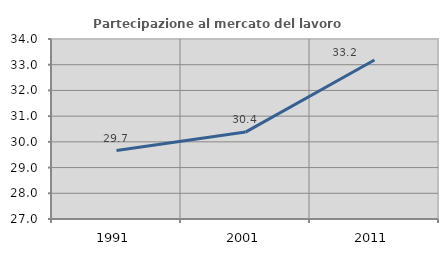
| Category | Partecipazione al mercato del lavoro  femminile |
|---|---|
| 1991.0 | 29.661 |
| 2001.0 | 30.38 |
| 2011.0 | 33.184 |